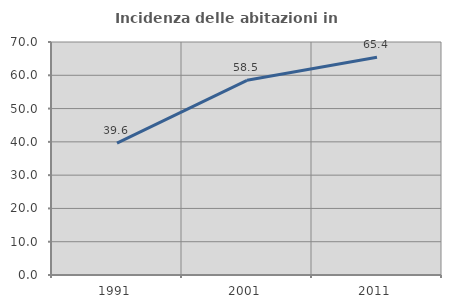
| Category | Incidenza delle abitazioni in proprietà  |
|---|---|
| 1991.0 | 39.645 |
| 2001.0 | 58.491 |
| 2011.0 | 65.399 |